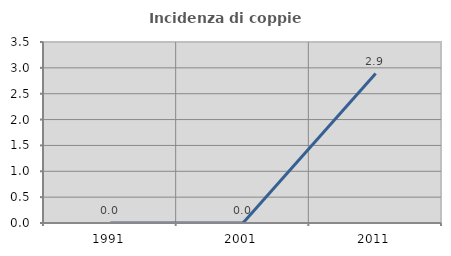
| Category | Incidenza di coppie miste |
|---|---|
| 1991.0 | 0 |
| 2001.0 | 0 |
| 2011.0 | 2.89 |